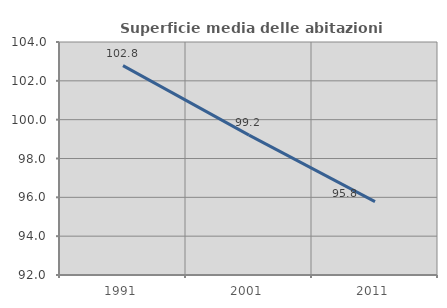
| Category | Superficie media delle abitazioni occupate |
|---|---|
| 1991.0 | 102.783 |
| 2001.0 | 99.204 |
| 2011.0 | 95.781 |